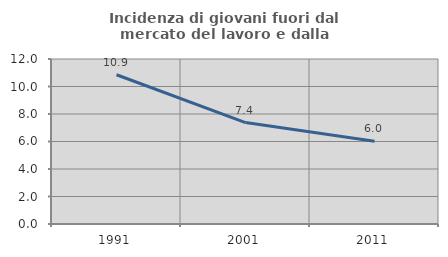
| Category | Incidenza di giovani fuori dal mercato del lavoro e dalla formazione  |
|---|---|
| 1991.0 | 10.853 |
| 2001.0 | 7.377 |
| 2011.0 | 6.024 |